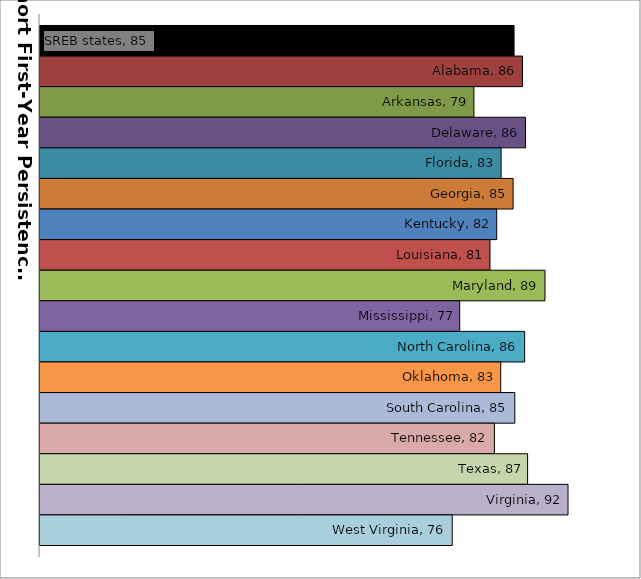
| Category | SREB states | Alabama | Arkansas | Delaware | Florida | Georgia | Kentucky | Louisiana | Maryland | Mississippi | North Carolina | Oklahoma | South Carolina | Tennessee | Texas | Virginia | West Virginia |
|---|---|---|---|---|---|---|---|---|---|---|---|---|---|---|---|---|---|
| 0 | 84.717 | 85.868 | 79.238 | 86.277 | 82.947 | 84.585 | 82.352 | 81.433 | 88.94 | 77.297 | 86.164 | 82.898 | 84.817 | 82.033 | 86.568 | 92.085 | 76.276 |